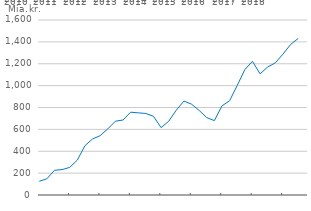
| Category | Udlandsformuen |
|---|---|
| 2010-03-01 | 125.22 |
| 2010-06-01 | 148.188 |
| 2010-09-01 | 226.132 |
| 2010-12-01 | 232.256 |
| 2011-03-01 | 252.458 |
| 2011-06-01 | 319.261 |
| 2011-09-01 | 451.187 |
| 2011-12-01 | 512.523 |
| 2012-03-01 | 542.657 |
| 2012-06-01 | 604.702 |
| 2012-09-01 | 674.825 |
| 2012-12-01 | 685.518 |
| 2013-03-01 | 757.008 |
| 2013-06-01 | 751.086 |
| 2013-09-01 | 745.321 |
| 2013-12-01 | 719.851 |
| 2014-03-01 | 616.11 |
| 2014-06-01 | 674.389 |
| 2014-09-01 | 775.757 |
| 2014-12-01 | 858.461 |
| 2015-03-01 | 830.41 |
| 2015-06-01 | 773.085 |
| 2015-09-01 | 707.493 |
| 2015-12-01 | 680.113 |
| 2016-03-01 | 815.226 |
| 2016-06-01 | 861.502 |
| 2016-09-01 | 1001.671 |
| 2016-12-01 | 1145.891 |
| 2017-03-01 | 1222.156 |
| 2017-06-01 | 1107.986 |
| 2017-09-01 | 1170.08 |
| 2017-12-01 | 1207.797 |
| 2018-03-01 | 1287.142 |
| 2018-06-01 | 1375.044 |
| 2018-09-01 | 1430.87 |